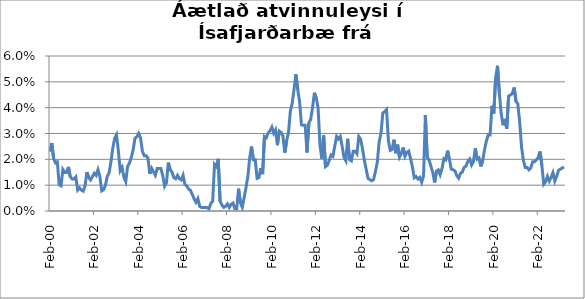
| Category | Series 0 |
|---|---|
| 2000-02-01 | 0.023 |
| 2000-03-01 | 0.026 |
| 2000-04-01 | 0.02 |
| 2000-05-01 | 0.019 |
| 2000-06-01 | 0.019 |
| 2000-07-01 | 0.01 |
| 2000-08-01 | 0.01 |
| 2000-09-01 | 0.016 |
| 2000-10-01 | 0.015 |
| 2000-11-01 | 0.015 |
| 2000-12-01 | 0.017 |
| 2001-01-01 | 0.013 |
| 2001-02-01 | 0.012 |
| 2001-03-01 | 0.012 |
| 2001-04-01 | 0.013 |
| 2001-05-01 | 0.008 |
| 2001-06-01 | 0.009 |
| 2001-07-01 | 0.008 |
| 2001-08-01 | 0.008 |
| 2001-09-01 | 0.01 |
| 2001-10-01 | 0.015 |
| 2001-11-01 | 0.013 |
| 2001-12-01 | 0.012 |
| 2002-01-01 | 0.013 |
| 2002-02-01 | 0.015 |
| 2002-03-01 | 0.014 |
| 2002-04-01 | 0.016 |
| 2002-05-01 | 0.013 |
| 2002-06-01 | 0.008 |
| 2002-07-01 | 0.008 |
| 2002-08-01 | 0.01 |
| 2002-09-01 | 0.013 |
| 2002-10-01 | 0.015 |
| 2002-11-01 | 0.019 |
| 2002-12-01 | 0.024 |
| 2003-01-01 | 0.028 |
| 2003-02-01 | 0.03 |
| 2003-03-01 | 0.023 |
| 2003-04-01 | 0.016 |
| 2003-05-01 | 0.017 |
| 2003-06-01 | 0.013 |
| 2003-07-01 | 0.011 |
| 2003-08-01 | 0.017 |
| 2003-09-01 | 0.019 |
| 2003-10-01 | 0.021 |
| 2003-11-01 | 0.024 |
| 2003-12-01 | 0.028 |
| 2004-01-01 | 0.029 |
| 2004-02-01 | 0.03 |
| 2004-03-01 | 0.028 |
| 2004-04-01 | 0.023 |
| 2004-05-01 | 0.021 |
| 2004-06-01 | 0.021 |
| 2004-07-01 | 0.02 |
| 2004-08-01 | 0.014 |
| 2004-09-01 | 0.017 |
| 2004-10-01 | 0.015 |
| 2004-11-01 | 0.014 |
| 2004-12-01 | 0.016 |
| 2005-01-01 | 0.016 |
| 2005-02-01 | 0.016 |
| 2005-03-01 | 0.014 |
| 2005-04-01 | 0.01 |
| 2005-05-01 | 0.011 |
| 2005-06-01 | 0.019 |
| 2005-07-01 | 0.016 |
| 2005-08-01 | 0.015 |
| 2005-09-01 | 0.013 |
| 2005-10-01 | 0.012 |
| 2005-11-01 | 0.014 |
| 2005-12-01 | 0.012 |
| 2006-01-01 | 0.012 |
| 2006-02-01 | 0.014 |
| 2006-03-01 | 0.01 |
| 2006-04-01 | 0.01 |
| 2006-05-01 | 0.008 |
| 2006-06-01 | 0.008 |
| 2006-07-01 | 0.006 |
| 2006-08-01 | 0.005 |
| 2006-09-01 | 0.003 |
| 2006-10-01 | 0.005 |
| 2006-11-01 | 0.002 |
| 2006-12-01 | 0.001 |
| 2007-01-01 | 0.001 |
| 2007-02-01 | 0.001 |
| 2007-03-01 | 0.001 |
| 2007-04-01 | 0.001 |
| 2007-05-01 | 0.003 |
| 2007-06-01 | 0.004 |
| 2007-07-01 | 0.018 |
| 2007-08-01 | 0.017 |
| 2007-09-01 | 0.02 |
| 2007-10-01 | 0.004 |
| 2007-11-01 | 0.002 |
| 2007-12-01 | 0.001 |
| 2008-01-01 | 0.002 |
| 2008-02-01 | 0.003 |
| 2008-03-01 | 0.001 |
| 2008-04-01 | 0.003 |
| 2008-05-01 | 0.003 |
| 2008-06-01 | 0.001 |
| 2008-07-01 | 0.001 |
| 2008-08-01 | 0.009 |
| 2008-09-01 | 0.003 |
| 2008-10-01 | 0.001 |
| 2008-11-01 | 0.005 |
| 2008-12-01 | 0.009 |
| 2009-01-01 | 0.013 |
| 2009-02-01 | 0.021 |
| 2009-03-01 | 0.025 |
| 2009-04-01 | 0.02 |
| 2009-05-01 | 0.02 |
| 2009-06-01 | 0.013 |
| 2009-07-01 | 0.013 |
| 2009-08-01 | 0.017 |
| 2009-09-01 | 0.014 |
| 2009-10-01 | 0.029 |
| 2009-11-01 | 0.028 |
| 2009-12-01 | 0.03 |
| 2010-01-01 | 0.031 |
| 2010-02-01 | 0.032 |
| 2010-03-01 | 0.03 |
| 2010-04-01 | 0.031 |
| 2010-05-01 | 0.025 |
| 2010-06-01 | 0.031 |
| 2010-07-01 | 0.03 |
| 2010-08-01 | 0.029 |
| 2010-09-01 | 0.023 |
| 2010-10-01 | 0.027 |
| 2010-11-01 | 0.031 |
| 2010-12-01 | 0.039 |
| 2011-01-01 | 0.042 |
| 2011-02-01 | 0.047 |
| 2011-03-01 | 0.053 |
| 2011-04-01 | 0.047 |
| 2011-05-01 | 0.042 |
| 2011-06-01 | 0.033 |
| 2011-07-01 | 0.033 |
| 2011-08-01 | 0.033 |
| 2011-09-01 | 0.023 |
| 2011-10-01 | 0.034 |
| 2011-11-01 | 0.036 |
| 2011-12-01 | 0.04 |
| 2012-01-01 | 0.046 |
| 2012-02-01 | 0.044 |
| 2012-03-01 | 0.04 |
| 2012-04-01 | 0.026 |
| 2012-05-01 | 0.02 |
| 2012-06-01 | 0.029 |
| 2012-07-01 | 0.017 |
| 2012-08-01 | 0.018 |
| 2012-09-01 | 0.02 |
| 2012-10-01 | 0.022 |
| 2012-11-01 | 0.021 |
| 2012-12-01 | 0.025 |
| 2013-01-01 | 0.029 |
| 2013-02-01 | 0.028 |
| 2013-03-01 | 0.029 |
| 2013-04-01 | 0.025 |
| 2013-05-01 | 0.021 |
| 2013-06-01 | 0.019 |
| 2013-07-01 | 0.028 |
| 2013-08-01 | 0.02 |
| 2013-09-01 | 0.019 |
| 2013-10-01 | 0.023 |
| 2013-11-01 | 0.023 |
| 2013-12-01 | 0.022 |
| 2014-01-01 | 0.029 |
| 2014-02-01 | 0.028 |
| 2014-03-01 | 0.024 |
| 2014-04-01 | 0.02 |
| 2014-05-01 | 0.016 |
| 2014-06-01 | 0.013 |
| 2014-07-01 | 0.012 |
| 2014-08-01 | 0.012 |
| 2014-09-01 | 0.012 |
| 2014-10-01 | 0.015 |
| 2014-11-01 | 0.019 |
| 2014-12-01 | 0.027 |
| 2015-01-01 | 0.03 |
| 2015-02-01 | 0.038 |
| 2015-03-01 | 0.038 |
| 2015-04-01 | 0.039 |
| 2015-05-01 | 0.027 |
| 2015-06-01 | 0.023 |
| 2015-07-01 | 0.024 |
| 2015-08-01 | 0.028 |
| 2015-09-01 | 0.022 |
| 2015-10-01 | 0.026 |
| 2015-11-01 | 0.021 |
| 2015-12-01 | 0.022 |
| 2016-01-01 | 0.025 |
| 2016-02-01 | 0.021 |
| 2016-03-01 | 0.023 |
| 2016-04-01 | 0.023 |
| 2016-05-01 | 0.02 |
| 2016-06-01 | 0.017 |
| 2016-07-01 | 0.013 |
| 2016-08-01 | 0.013 |
| 2016-09-01 | 0.012 |
| 2016-10-01 | 0.013 |
| 2016-11-01 | 0.011 |
| 2016-12-01 | 0.014 |
| 2017-01-01 | 0.037 |
| 2017-02-01 | 0.021 |
| 2017-03-01 | 0.02 |
| 2017-04-01 | 0.017 |
| 2017-05-01 | 0.015 |
| 2017-06-01 | 0.011 |
| 2017-07-01 | 0.015 |
| 2017-08-01 | 0.016 |
| 2017-09-01 | 0.014 |
| 2017-10-01 | 0.016 |
| 2017-11-01 | 0.02 |
| 2017-12-01 | 0.02 |
| 2018-01-01 | 0.023 |
| 2018-02-01 | 0.02 |
| 2018-03-01 | 0.016 |
| 2018-04-01 | 0.016 |
| 2018-05-01 | 0.016 |
| 2018-06-01 | 0.014 |
| 2018-07-01 | 0.013 |
| 2018-08-01 | 0.015 |
| 2018-09-01 | 0.015 |
| 2018-10-01 | 0.017 |
| 2018-11-01 | 0.017 |
| 2018-12-01 | 0.019 |
| 2019-01-01 | 0.02 |
| 2019-02-01 | 0.018 |
| 2019-03-01 | 0.019 |
| 2019-04-01 | 0.024 |
| 2019-05-01 | 0.02 |
| 2019-06-01 | 0.021 |
| 2019-07-01 | 0.017 |
| 2019-08-01 | 0.02 |
| 2019-09-01 | 0.024 |
| 2019-10-01 | 0.027 |
| 2019-11-01 | 0.029 |
| 2019-12-01 | 0.029 |
| 2020-01-01 | 0.041 |
| 2020-02-01 | 0.038 |
| 2020-03-01 | 0.052 |
| 2020-04-01 | 0.056 |
| 2020-05-01 | 0.046 |
| 2020-06-01 | 0.038 |
| 2020-07-01 | 0.033 |
| 2020-08-01 | 0.036 |
| 2020-09-01 | 0.032 |
| 2020-10-01 | 0.044 |
| 2020-11-01 | 0.045 |
| 2020-12-01 | 0.045 |
| 2021-01-01 | 0.048 |
| 2021-02-01 | 0.042 |
| 2021-03-01 | 0.041 |
| 2021-04-01 | 0.034 |
| 2021-05-01 | 0.025 |
| 2021-06-01 | 0.02 |
| 2021-07-01 | 0.017 |
| 2021-08-01 | 0.017 |
| 2021-09-01 | 0.016 |
| 2021-10-01 | 0.017 |
| 2021-11-01 | 0.019 |
| 2021-12-01 | 0.019 |
| 2022-01-01 | 0.02 |
| 2022-02-01 | 0.021 |
| 2022-03-01 | 0.023 |
| 2022-04-01 | 0.018 |
| 2022-05-01 | 0.01 |
| 2022-06-01 | 0.011 |
| 2022-07-01 | 0.013 |
| 2022-08-01 | 0.012 |
| 2022-09-01 | 0.013 |
| 2022-10-01 | 0.015 |
| 2022-11-01 | 0.012 |
| 2022-12-01 | 0.013 |
| 2023-01-01 | 0.016 |
| 2023-02-01 | 0.016 |
| 2023-03-01 | 0.017 |
| 2023-04-01 | 0.017 |